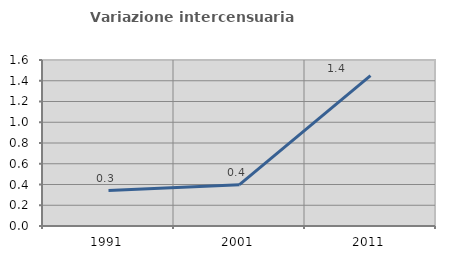
| Category | Variazione intercensuaria annua |
|---|---|
| 1991.0 | 0.341 |
| 2001.0 | 0.399 |
| 2011.0 | 1.45 |